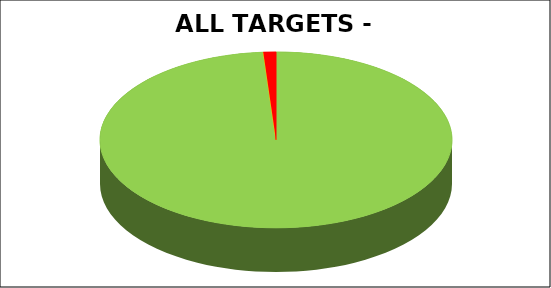
| Category | Series 0 |
|---|---|
| Green | 0.989 |
| Amber | 0 |
| Red | 0.011 |